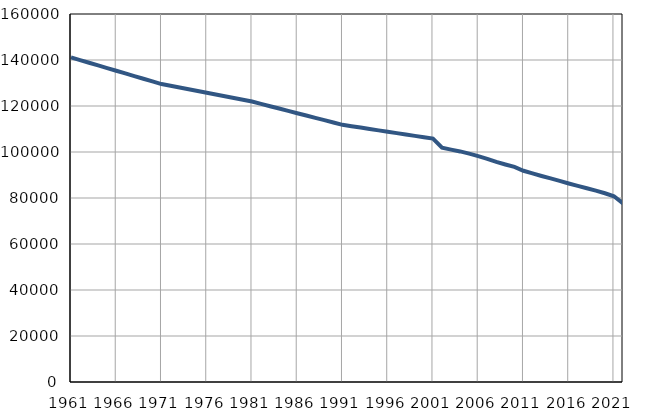
| Category | Број
становника |
|---|---|
| 1961.0 | 141141 |
| 1962.0 | 139981 |
| 1963.0 | 138821 |
| 1964.0 | 137661 |
| 1965.0 | 136501 |
| 1966.0 | 135342 |
| 1967.0 | 134182 |
| 1968.0 | 133022 |
| 1969.0 | 131862 |
| 1970.0 | 130702 |
| 1971.0 | 129542 |
| 1972.0 | 128781 |
| 1973.0 | 128020 |
| 1974.0 | 127259 |
| 1975.0 | 126498 |
| 1976.0 | 125738 |
| 1977.0 | 124977 |
| 1978.0 | 124216 |
| 1979.0 | 123455 |
| 1980.0 | 122694 |
| 1981.0 | 121933 |
| 1982.0 | 120921 |
| 1983.0 | 119909 |
| 1984.0 | 118897 |
| 1985.0 | 117885 |
| 1986.0 | 116873 |
| 1987.0 | 115861 |
| 1988.0 | 114849 |
| 1989.0 | 113837 |
| 1990.0 | 112825 |
| 1991.0 | 111813 |
| 1992.0 | 111213 |
| 1993.0 | 110612 |
| 1994.0 | 110012 |
| 1995.0 | 109411 |
| 1996.0 | 108811 |
| 1997.0 | 108210 |
| 1998.0 | 107610 |
| 1999.0 | 107009 |
| 2000.0 | 106409 |
| 2001.0 | 105808 |
| 2002.0 | 101879 |
| 2003.0 | 101045 |
| 2004.0 | 100254 |
| 2005.0 | 99288 |
| 2006.0 | 98230 |
| 2007.0 | 97036 |
| 2008.0 | 95703 |
| 2009.0 | 94570 |
| 2010.0 | 93513 |
| 2011.0 | 91832 |
| 2012.0 | 90707 |
| 2013.0 | 89574 |
| 2014.0 | 88513 |
| 2015.0 | 87414 |
| 2016.0 | 86327 |
| 2017.0 | 85287 |
| 2018.0 | 84252 |
| 2019.0 | 83200 |
| 2020.0 | 82067 |
| 2021.0 | 80765 |
| 2022.0 | 77649 |